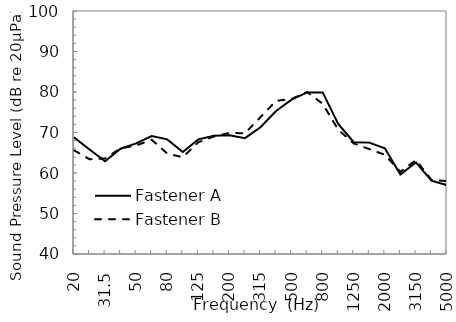
| Category | Fastener A | Fastener B |
|---|---|---|
| 20.0 | 68.8 | 65.6 |
| 25.0 | 65.8 | 63.4 |
| 31.5 | 62.9 | 63.6 |
| 40.0 | 66 | 66.1 |
| 50.0 | 67.3 | 66.8 |
| 63.0 | 69.1 | 68.2 |
| 80.0 | 68.3 | 64.8 |
| 100.0 | 65.2 | 63.9 |
| 125.0 | 68.3 | 67.6 |
| 160.0 | 69.2 | 69 |
| 200.0 | 69.3 | 69.9 |
| 250.0 | 68.6 | 69.8 |
| 315.0 | 71.3 | 73.8 |
| 400.0 | 75.3 | 77.8 |
| 500.0 | 78.1 | 78.3 |
| 630.0 | 79.9 | 80 |
| 800.0 | 79.9 | 77.1 |
| 1000.0 | 72.1 | 70.7 |
| 1250.0 | 67.6 | 67.3 |
| 1600.0 | 67.5 | 65.9 |
| 2000.0 | 66.1 | 64.5 |
| 2500.0 | 59.6 | 60.3 |
| 3150.0 | 62.6 | 63.2 |
| 4000.0 | 58.1 | 58.3 |
| 5000.0 | 57 | 58 |